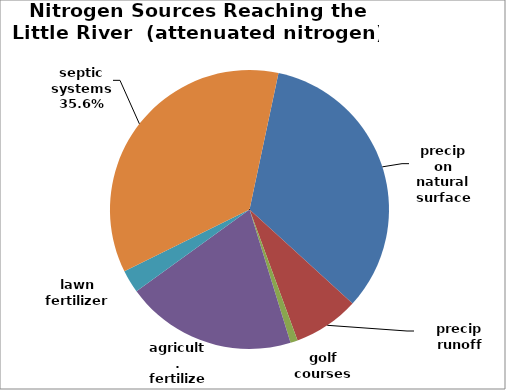
| Category | precip on natural surface precip runoff golf courses agricult. fertilizer lawn fertilizer septic systems |
|---|---|
| precip on natural surface | 1458.665 |
| precip runoff | 332.61 |
| golf courses | 36.936 |
| agricult. fertilizer | 863.136 |
| lawn fertilizer | 116.653 |
| septic systems | 1553.803 |